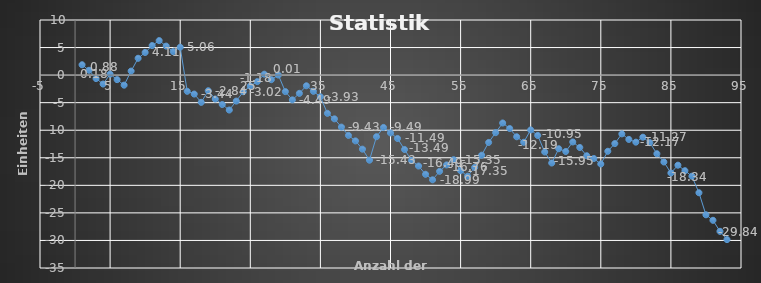
| Category | Series 0 |
|---|---|
| 0 | 1.879 |
| 1 | 0.879 |
| 2 | -0.621 |
| 3 | -1.621 |
| 4 | 0.179 |
| 5 | -0.821 |
| 6 | -1.821 |
| 7 | 0.729 |
| 8 | 3.054 |
| 9 | 4.114 |
| 10 | 5.364 |
| 11 | 6.264 |
| 12 | 5.264 |
| 13 | 4.264 |
| 14 | 5.064 |
| 15 | -2.936 |
| 16 | -3.436 |
| 17 | -4.936 |
| 18 | -2.836 |
| 19 | -4.336 |
| 20 | -5.336 |
| 21 | -6.336 |
| 22 | -4.716 |
| 23 | -3.016 |
| 24 | -1.986 |
| 25 | -1.176 |
| 26 | 0.171 |
| 27 | -0.829 |
| 28 | 0.011 |
| 29 | -2.989 |
| 30 | -4.489 |
| 31 | -3.309 |
| 32 | -1.934 |
| 33 | -2.934 |
| 34 | -3.934 |
| 35 | -6.934 |
| 36 | -7.934 |
| 37 | -9.434 |
| 38 | -10.934 |
| 39 | -11.934 |
| 40 | -13.434 |
| 41 | -15.434 |
| 42 | -11.174 |
| 43 | -9.494 |
| 44 | -10.494 |
| 45 | -11.494 |
| 46 | -13.494 |
| 47 | -15.494 |
| 48 | -16.494 |
| 49 | -17.994 |
| 50 | -18.994 |
| 51 | -17.457 |
| 52 | -16.297 |
| 53 | -15.347 |
| 54 | -17.347 |
| 55 | -18.347 |
| 56 | -16.758 |
| 57 | -14.529 |
| 58 | -12.219 |
| 59 | -10.442 |
| 60 | -8.687 |
| 61 | -9.687 |
| 62 | -11.187 |
| 63 | -12.187 |
| 64 | -9.947 |
| 65 | -10.947 |
| 66 | -13.947 |
| 67 | -15.947 |
| 68 | -13.357 |
| 69 | -13.857 |
| 70 | -12.13 |
| 71 | -13.13 |
| 72 | -14.63 |
| 73 | -15.13 |
| 74 | -16.13 |
| 75 | -13.82 |
| 76 | -12.42 |
| 77 | -10.665 |
| 78 | -11.665 |
| 79 | -12.165 |
| 80 | -11.265 |
| 81 | -12.265 |
| 82 | -14.265 |
| 83 | -15.765 |
| 84 | -17.765 |
| 85 | -16.344 |
| 86 | -17.344 |
| 87 | -18.344 |
| 88 | -21.344 |
| 89 | -25.344 |
| 90 | -26.344 |
| 91 | -28.344 |
| 92 | -29.844 |